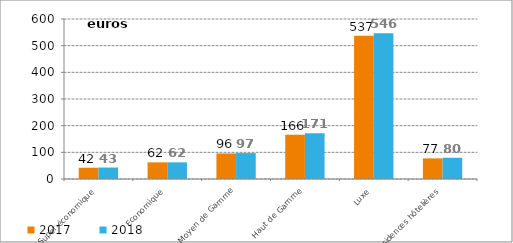
| Category | 2017 | 2018 |
|---|---|---|
| Super-économique | 42.298 | 43.029 |
| Economique | 62.423 | 62.457 |
| Moyen de Gamme | 95.764 | 97.186 |
| Haut de Gamme | 166.035 | 171.479 |
| Luxe | 536.782 | 546.483 |
| Résidences hôtelières | 77.316 | 79.639 |